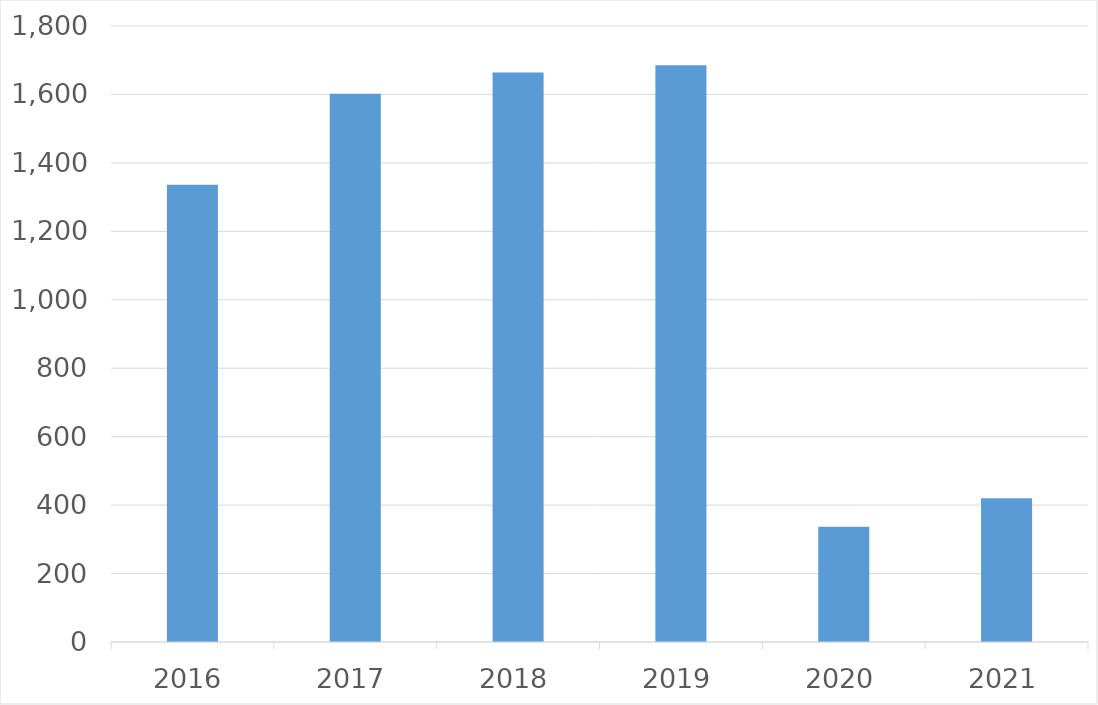
| Category | Series 0 |
|---|---|
| 2016 | 1336 |
| 2017 | 1602 |
| 2018 | 1664 |
| 2019 | 1685 |
| 2020 | 337 |
| 2021 | 420 |